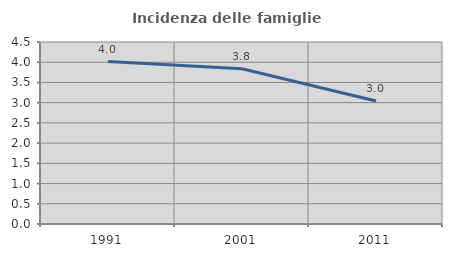
| Category | Incidenza delle famiglie numerose |
|---|---|
| 1991.0 | 4.018 |
| 2001.0 | 3.837 |
| 2011.0 | 3.04 |